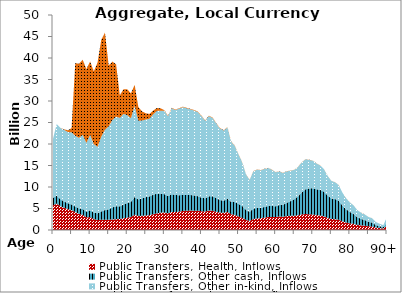
| Category | Public Transfers, Health, Inflows | Public Transfers, Other cash, Inflows | Public Transfers, Other in-kind, Inflows | Public Transfers, Education, Inflows |
|---|---|---|---|---|
| 0 | 5713.731 | 1758.303 | 13763.425 | 0 |
|  | 6143.341 | 1855.033 | 16635.999 | 0 |
| 2 | 5543.784 | 1613.186 | 16589.627 | 0 |
| 3 | 5160.463 | 1458.325 | 16666.056 | 134.087 |
| 4 | 4856.354 | 1379.361 | 16552.004 | 398.181 |
| 5 | 4603.273 | 1331.663 | 16771.72 | 965.854 |
| 6 | 4171.006 | 1274.686 | 16474.184 | 16913.976 |
| 7 | 3752.566 | 1281.966 | 16388.696 | 17235.113 |
| 8 | 3513.972 | 1373.006 | 17233.232 | 17467.891 |
| 9 | 2945.777 | 1324.839 | 15983.644 | 17158.912 |
| 10 | 3004.78 | 1562.585 | 17552.384 | 17072.216 |
| 11 | 2534.009 | 1550.399 | 15889.664 | 16907.083 |
| 12 | 2297.772 | 1586.33 | 15459.702 | 19579.948 |
| 13 | 2390.998 | 1909.576 | 17371.989 | 22545.156 |
| 14 | 2400.738 | 2243.728 | 18686.941 | 22579.778 |
| 15 | 2377.936 | 2425.045 | 19280.571 | 14159.674 |
| 16 | 2463.103 | 2795.083 | 20320.839 | 13583.578 |
| 17 | 2523.911 | 2995.732 | 20841.23 | 12191.525 |
| 18 | 2547.744 | 2943.197 | 20585.949 | 5240.006 |
| 19 | 2736.375 | 3218.523 | 21057.806 | 5706.408 |
| 20 | 2868.883 | 3407.573 | 20446.163 | 5998.953 |
| 21 | 3024.687 | 3505.207 | 19471.825 | 5768.378 |
| 22 | 3569.106 | 4099.693 | 21219.724 | 4865.948 |
| 23 | 3251.866 | 3849.676 | 18316.733 | 3179.592 |
| 24 | 3310.335 | 4076.74 | 18058.673 | 2138.577 |
| 25 | 3384.599 | 4245.041 | 18051.313 | 1456.266 |
| 26 | 3457.035 | 4349.34 | 18079.26 | 1105.941 |
| 27 | 3666.815 | 4559.622 | 18694.661 | 852.369 |
| 28 | 3877.409 | 4548.832 | 19266.983 | 692.098 |
| 29 | 4030.425 | 4318.888 | 19401.366 | 536.491 |
| 30 | 4086.093 | 4256.082 | 19405.38 | 107.177 |
| 31 | 3886.196 | 3994.897 | 18571.91 | 102.573 |
| 32 | 4192.749 | 4141.502 | 19978.372 | 110.341 |
| 33 | 4171.096 | 3956.088 | 19750.215 | 109.081 |
| 34 | 4292.415 | 3804.494 | 20122.224 | 111.136 |
| 35 | 4433.992 | 3704.656 | 20430.619 | 112.839 |
| 36 | 4485.85 | 3658.87 | 20168.751 | 111.393 |
| 37 | 4514.405 | 3620.622 | 19923.404 | 110.038 |
| 38 | 4491.672 | 3569.553 | 19741.208 | 109.032 |
| 39 | 4497.536 | 3369.401 | 19594.936 | 108.224 |
| 40 | 4370.236 | 3144.507 | 18980.513 | 104.83 |
| 41 | 4276.891 | 3095.639 | 18028.41 | 99.572 |
| 42 | 4538.753 | 3285.813 | 18652.766 | 103.02 |
| 43 | 4472.082 | 3357.233 | 18243.803 | 100.761 |
| 44 | 4230.813 | 3225.001 | 17288.457 | 95.485 |
| 45 | 4051.464 | 2914.303 | 16653.138 | 91.976 |
| 46 | 4006.066 | 2796.599 | 16324.825 | 90.163 |
| 47 | 4187.068 | 3084.544 | 16549.482 | 91.404 |
| 48 | 3668.851 | 2882.986 | 13978.097 | 77.202 |
| 49 | 3502.115 | 3000.699 | 13036.184 | 71.999 |
| 50 | 3146.16 | 2917.068 | 11470.687 | 63.353 |
| 51 | 2822.753 | 2765.675 | 10113.017 | 55.855 |
| 52 | 2341.736 | 2317.061 | 8245.97 | 45.543 |
| 53 | 2134.991 | 2097.034 | 7426.911 | 41.019 |
| 54 | 2552.819 | 2428.52 | 8696.674 | 48.032 |
| 55 | 2688.385 | 2456.597 | 8890.348 | 49.102 |
| 56 | 2733.068 | 2420.555 | 8741.966 | 48.282 |
| 57 | 2882.257 | 2481.498 | 8847.732 | 48.866 |
| 58 | 3031.445 | 2548.014 | 8831.52 | 48.777 |
| 59 | 3050.943 | 2523.195 | 8412.623 | 46.463 |
| 60 | 3017.843 | 2501.356 | 7902.474 | 43.646 |
| 61 | 3131.292 | 2680.786 | 7805.406 | 43.11 |
| 62 | 3096.381 | 2783.899 | 7367.672 | 40.692 |
| 63 | 3235.728 | 3092.796 | 7312.292 | 40.386 |
| 64 | 3299.227 | 3419.335 | 7071.32 | 39.055 |
| 65 | 3319.138 | 3835.501 | 6816.914 | 37.65 |
| 66 | 3429.913 | 4390.16 | 6818.201 | 37.657 |
| 67 | 3617.254 | 5097.117 | 6982.641 | 38.565 |
| 68 | 3718.715 | 5725.722 | 6966.274 | 38.475 |
| 69 | 3666.631 | 6002.372 | 6652.114 | 36.74 |
| 70 | 3599.436 | 6124.448 | 6387.415 | 35.278 |
| 71 | 3459.468 | 6013.275 | 5984.525 | 33.053 |
| 72 | 3387.953 | 5954.676 | 5701.401 | 31.489 |
| 73 | 3167.967 | 5750.379 | 5232.014 | 28.897 |
| 74 | 2831.386 | 5217.793 | 4554.594 | 25.155 |
| 75 | 2564.509 | 4794.953 | 4059.886 | 22.423 |
| 76 | 2513.031 | 4696.512 | 3896.784 | 21.522 |
| 77 | 2387.698 | 4412.07 | 3623.387 | 20.012 |
| 78 | 2015.581 | 3656.037 | 2991.105 | 16.52 |
| 79 | 1742.516 | 3087.091 | 2533.761 | 13.994 |
| 80 | 1543.596 | 2652.701 | 2203.544 | 12.17 |
| 81 | 1419.644 | 2316.439 | 1991.651 | 11 |
| 82 | 1182.264 | 1802.152 | 1625.2 | 8.976 |
| 83 | 1075.897 | 1527.837 | 1447.378 | 7.994 |
| 84 | 995.922 | 1314.808 | 1310.114 | 7.236 |
| 85 | 867.186 | 1057.603 | 1115.514 | 6.161 |
| 86 | 808.099 | 908.08 | 1017.004 | 5.617 |
| 87 | 567.916 | 585.762 | 699.808 | 3.865 |
| 88 | 460.427 | 433.584 | 555.956 | 3.071 |
| 89 | 367.423 | 313.588 | 435.006 | 2.403 |
| 90+ | 1037.328 | 789.214 | 1204.141 | 6.651 |